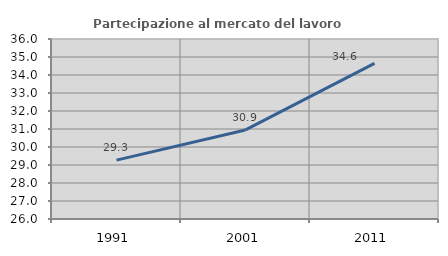
| Category | Partecipazione al mercato del lavoro  femminile |
|---|---|
| 1991.0 | 29.271 |
| 2001.0 | 30.948 |
| 2011.0 | 34.646 |